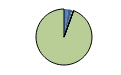
| Category | Series 0 |
|---|---|
| ARRASTRE | 69 |
| CERCO | 53 |
| ATUNEROS CAÑEROS | 15 |
| PALANGRE DE FONDO | 15 |
| PALANGRE DE SUPERFICIE | 2 |
| RASCO | 1 |
| VOLANTA | 1 |
| ARTES FIJAS | 2 |
| ARTES MENORES | 2664 |